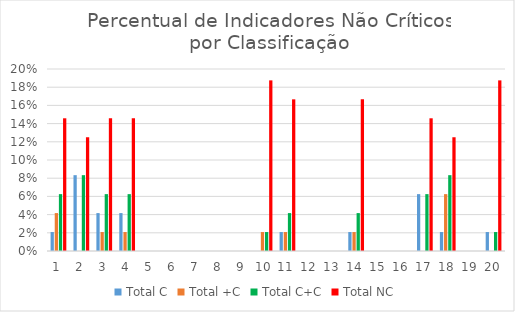
| Category | Total C | Total +C | Total C+C | Total NC |
|---|---|---|---|---|
| 0 | 0.021 | 0.042 | 0.062 | 0.146 |
| 1 | 0.083 | 0 | 0.083 | 0.125 |
| 2 | 0.042 | 0.021 | 0.062 | 0.146 |
| 3 | 0.042 | 0.021 | 0.062 | 0.146 |
| 4 | 0 | 0 | 0 | 0 |
| 5 | 0 | 0 | 0 | 0 |
| 6 | 0 | 0 | 0 | 0 |
| 7 | 0 | 0 | 0 | 0 |
| 8 | 0 | 0 | 0 | 0 |
| 9 | 0 | 0.021 | 0.021 | 0.188 |
| 10 | 0.021 | 0.021 | 0.042 | 0.167 |
| 11 | 0 | 0 | 0 | 0 |
| 12 | 0 | 0 | 0 | 0 |
| 13 | 0.021 | 0.021 | 0.042 | 0.167 |
| 14 | 0 | 0 | 0 | 0 |
| 15 | 0 | 0 | 0 | 0 |
| 16 | 0.062 | 0 | 0.062 | 0.146 |
| 17 | 0.021 | 0.062 | 0.083 | 0.125 |
| 18 | 0 | 0 | 0 | 0 |
| 19 | 0.021 | 0 | 0.021 | 0.188 |